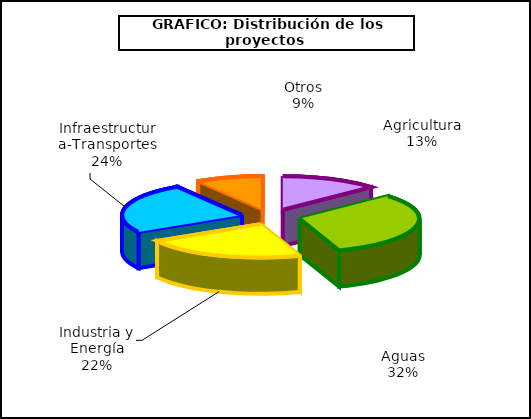
| Category | Series 0 |
|---|---|
| 0 | 1165 |
| 1 | 2791 |
| 2 | 1938 |
| 3 | 2160 |
| 4 | 798 |